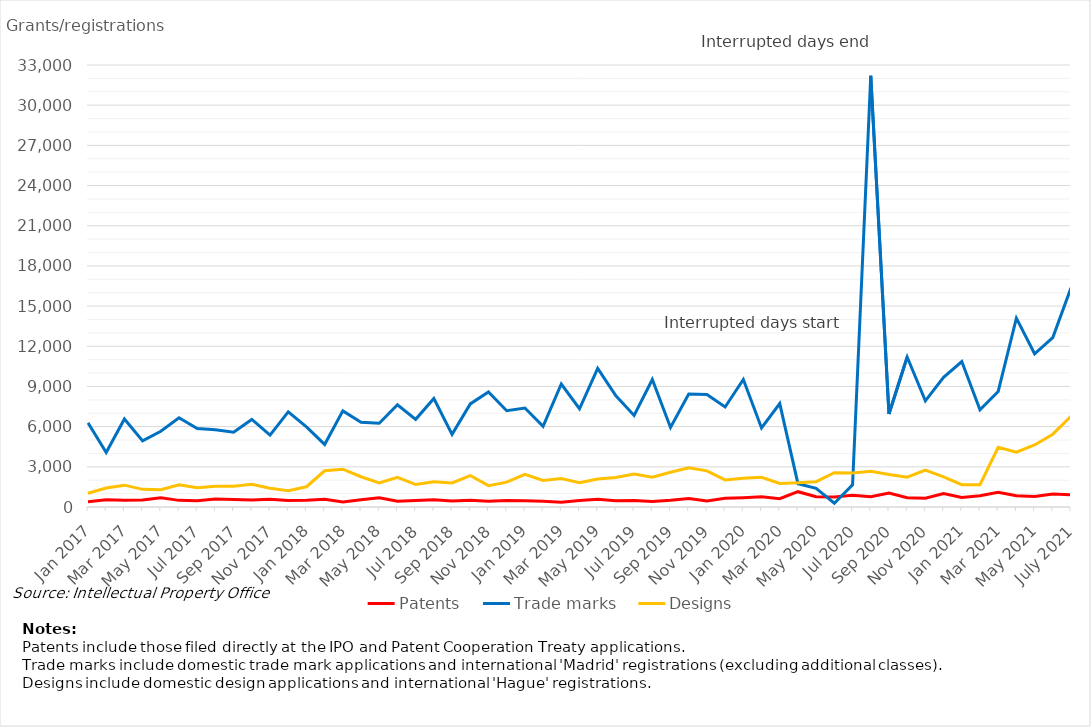
| Category | Patents | Trade marks | Designs |
|---|---|---|---|
| Jan 2017 | 387 | 6288 | 1026 |
| Feb 2017 | 533 | 4063 | 1420 |
| Mar 2017 | 505 | 6576 | 1631 |
| Apr 2017 | 516 | 4937 | 1318 |
| May 2017 | 681 | 5651 | 1284 |
| Jun 2017 | 495 | 6659 | 1660 |
| Jul 2017 | 466 | 5857 | 1437 |
| Aug 2017 | 592 | 5763 | 1550 |
| Sep 2017 | 554 | 5578 | 1553 |
| Oct 2017 | 517 | 6539 | 1705 |
| Nov 2017 | 578 | 5364 | 1397 |
| Dec 2017 | 487 | 7101 | 1218 |
| Jan 2018 | 495 | 5978 | 1512 |
| Feb 2018 | 574 | 4670 | 2704 |
| Mar 2018 | 370 | 7176 | 2825 |
| Apr 2018 | 543 | 6332 | 2259 |
| May 2018 | 690 | 6251 | 1789 |
| Jun 2018 | 424 | 7636 | 2222 |
| Jul 2018 | 486 | 6547 | 1678 |
| Aug 2018 | 536 | 8103 | 1878 |
| Sep 2018 | 450 | 5426 | 1795 |
| Oct 2018 | 498 | 7699 | 2348 |
| Nov 2018 | 432 | 8591 | 1592 |
| Dec 2018 | 484 | 7189 | 1859 |
| Jan 2019 | 475 | 7393 | 2444 |
| Feb 2019 | 426 | 6021 | 1987 |
| Mar 2019 | 363 | 9184 | 2125 |
| Apr 2019 | 488 | 7335 | 1810 |
| May 2019 | 573 | 10345 | 2096 |
| Jun 2019 | 471 | 8304 | 2202 |
| Jul 2019 | 489 | 6839 | 2464 |
| Aug 2019 | 420 | 9515 | 2218 |
| Sep 2019 | 500 | 5942 | 2596 |
| Oct 2019 | 634 | 8436 | 2926 |
| Nov 2019 | 455 | 8398 | 2700 |
| Dec 2019 | 654 | 7465 | 2021 |
| Jan 2020 | 696 | 9517 | 2145 |
| Feb 2020 | 756 | 5905 | 2220 |
| Mar 2020 | 622 | 7719 | 1758 |
| Apr 2020 | 1143 | 1741 | 1803 |
| May 2020 | 768 | 1398 | 1888 |
| Jun 2020 | 740 | 280 | 2564 |
| Jul 2020 | 878 | 1657 | 2539 |
| Aug 2020 | 771 | 32198 | 2665 |
| Sep 2020 | 1042 | 6941 | 2425 |
| Oct 2020 | 697 | 11197 | 2223 |
| Nov 2020 | 649 | 7926 | 2763 |
| Dec 2020 | 1010 | 9680 | 2252 |
| Jan 2021 | 708 | 10856 | 1665 |
| Feb 2021 | 838 | 7254 | 1661 |
| Mar 2021 | 1107 | 8626 | 4453 |
| Apr 2021 | 838 | 14099 | 4098 |
| May 2021 | 788 | 11439 | 4628 |
| June 2021 | 972 | 12653 | 5436 |
| July 2021 | 918 | 16366 | 6776 |